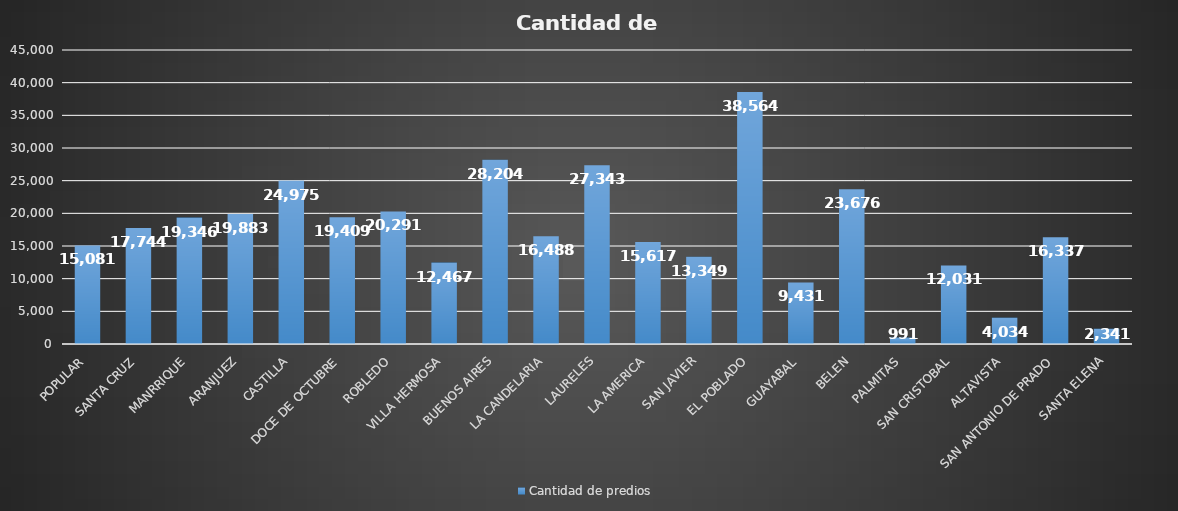
| Category | Cantidad de predios  |
|---|---|
| POPULAR | 15081 |
| SANTA CRUZ | 17744 |
| MANRRIQUE | 19346 |
| ARANJUEZ | 19883 |
| CASTILLA | 24975 |
| DOCE DE OCTUBRE | 19409 |
| ROBLEDO | 20291 |
| VILLA HERMOSA | 12467 |
| BUENOS AIRES | 28204 |
| LA CANDELARIA | 16488 |
| LAURELES | 27343 |
| LA AMERICA | 15617 |
| SAN JAVIER | 13349 |
| EL POBLADO | 38564 |
| GUAYABAL | 9431 |
| BELEN | 23676 |
| PALMITAS | 991 |
| SAN CRISTOBAL | 12031 |
| ALTAVISTA | 4034 |
| SAN ANTONIO DE PRADO | 16337 |
| SANTA ELENA | 2341 |